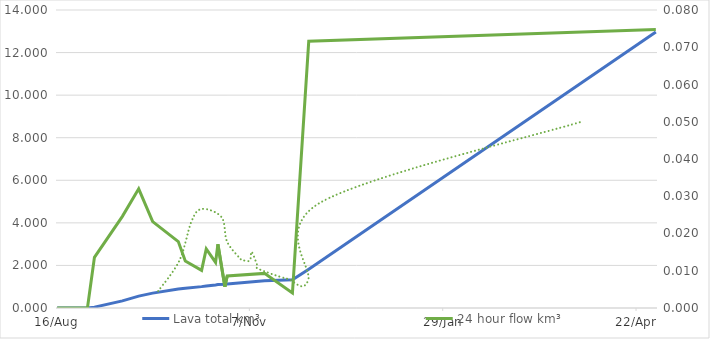
| Category | Lava total km³ |
|---|---|
| 2014-08-16 | 0 |
| 2014-08-29 | 0 |
| 2014-09-01 | 0.041 |
| 2014-09-13 | 0.336 |
| 2014-09-20 | 0.56 |
| 2014-09-26 | 0.699 |
| 2014-10-07 | 0.895 |
| 2014-10-10 | 0.933 |
| 2014-10-17 | 1.004 |
| 2014-10-19 | 1.036 |
| 2014-10-23 | 1.084 |
| 2014-10-24 | 1.102 |
| 2014-10-27 | 1.119 |
| 2014-10-28 | 1.127 |
| 2014-11-13 | 1.276 |
| 2014-11-25 | 1.324 |
| 2014-12-02 | 1.825 |
| 2015-04-30 | 12.969 |